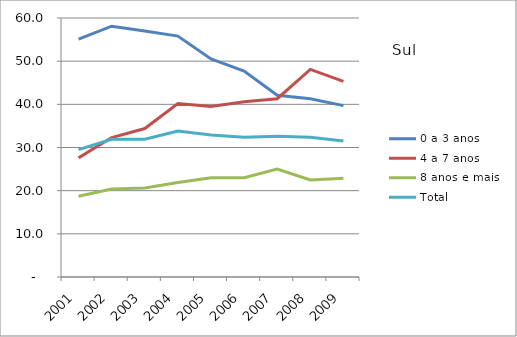
| Category | 0 a 3 anos | 4 a 7 anos | 8 anos e mais | Total |
|---|---|---|---|---|
| 2001.0 | 55.1 | 27.6 | 18.7 | 29.5 |
| 2002.0 | 58.1 | 32.3 | 20.4 | 31.9 |
| 2003.0 | 57 | 34.4 | 20.6 | 31.9 |
| 2004.0 | 55.8 | 40.2 | 21.9 | 33.8 |
| 2005.0 | 50.5 | 39.5 | 23 | 32.9 |
| 2006.0 | 47.7 | 40.6 | 23 | 32.4 |
| 2007.0 | 42.1 | 41.3 | 25 | 32.6 |
| 2008.0 | 41.3 | 48.1 | 22.5 | 32.4 |
| 2009.0 | 39.7 | 45.3 | 22.9 | 31.5 |